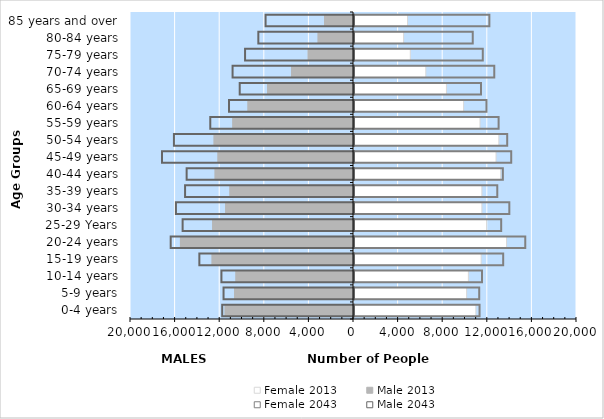
| Category | Female 2013 | Male 2013 | Female 2043 | Male 2043 |
|---|---|---|---|---|
|   0-4 years | 10930 | -11510 | 11260 | -11820 |
|   5-9 years | 10100 | -10660 | 11230 | -11700 |
|   10-14 years | 10260 | -10540 | 11480 | -11890 |
|   15-19 years | 11400 | -12680 | 13380 | -13870 |
|   20-24 years | 13680 | -15520 | 15360 | -16440 |
|   25-29 Years | 11890 | -12630 | 13200 | -15370 |
|   30-34 years | 11470 | -11460 | 13930 | -15970 |
|   35-39 years | 11470 | -11080 | 12850 | -15150 |
|   40-44 years | 13160 | -12410 | 13350 | -15010 |
|   45-49 years | 12740 | -12150 | 14100 | -17220 |
|   50-54 years | 12990 | -12500 | 13740 | -16150 |
|   55-59 years | 11300 | -10820 | 12970 | -12890 |
|   60-64 years | 9830 | -9460 | 11880 | -11210 |
|   65-69 years | 8290 | -7700 | 11390 | -10250 |
|   70-74 years | 6440 | -5550 | 12580 | -10890 |
|   75-79 years | 5050 | -4060 | 11550 | -9770 |
|   80-84 years | 4450 | -3170 | 10650 | -8580 |
|   85 years and over | 4800 | -2600 | 12140 | -7930 |